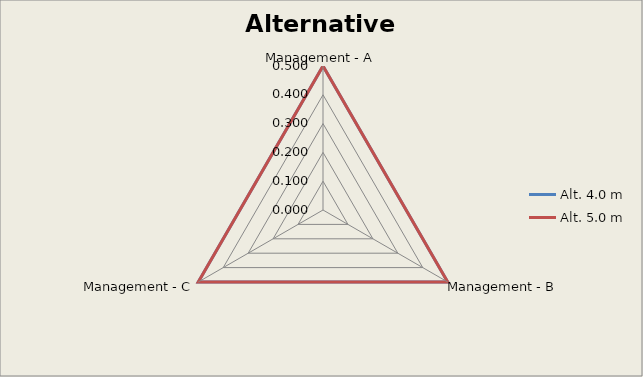
| Category | Alt. 4.0 m | Alt. 5.0 m |
|---|---|---|
| Management - A | 0.5 | 0.5 |
| Management - B | 0.5 | 0.5 |
| Management - C | 0.5 | 0.5 |